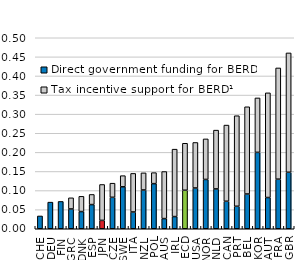
| Category | Direct government funding for BERD | Tax incentive support for BERD¹ |
|---|---|---|
| CHE | 0.034 | 0 |
| DEU | 0.07 | 0 |
| FIN | 0.072 | 0 |
| GRC | 0.052 | 0.029 |
| DNK | 0.045 | 0.04 |
| ESP | 0.063 | 0.026 |
| JPN | 0.022 | 0.094 |
| CZE | 0.082 | 0.037 |
| SWE | 0.11 | 0.029 |
| ITA | 0.044 | 0.101 |
| NZL | 0.102 | 0.045 |
| POL | 0.118 | 0.029 |
| AUS | 0.027 | 0.123 |
| IRL | 0.032 | 0.176 |
| OECD | 0.101 | 0.123 |
| USA | 0.107 | 0.119 |
| NOR | 0.129 | 0.106 |
| NLD | 0.104 | 0.154 |
| CAN | 0.072 | 0.199 |
| PRT | 0.059 | 0.237 |
| BEL | 0.091 | 0.228 |
| KOR | 0.2 | 0.142 |
| AUT | 0.082 | 0.274 |
| FRA | 0.13 | 0.291 |
| GBR | 0.148 | 0.312 |